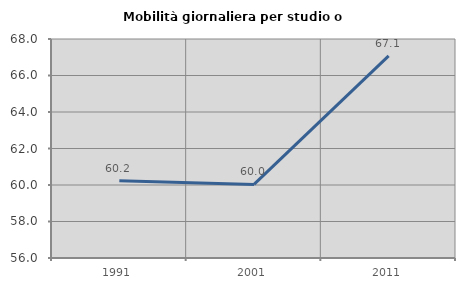
| Category | Mobilità giornaliera per studio o lavoro |
|---|---|
| 1991.0 | 60.236 |
| 2001.0 | 60.032 |
| 2011.0 | 67.08 |